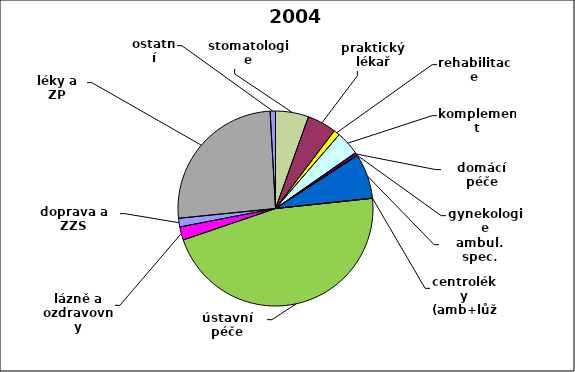
| Category | Series 0 |
|---|---|
| stomatologie | 0.055 |
| praktický lékař | 0.048 |
| rehabilitace | 0.01 |
| komplement | 0.04 |
| domácí péče | 0.005 |
| gynekologie | 0 |
| ambul. spec. | 0.075 |
| centroléky (amb+lůž) | 0 |
| ústavní péče | 0.464 |
| lázně a ozdravovny | 0.022 |
| doprava a ZZS | 0.014 |
| léky a ZP | 0.257 |
| ostatní | 0.009 |